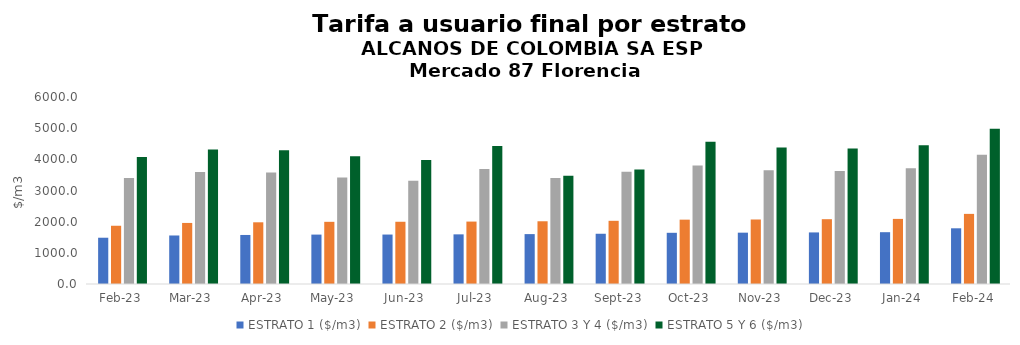
| Category | ESTRATO 1 ($/m3) | ESTRATO 2 ($/m3) | ESTRATO 3 Y 4 ($/m3) | ESTRATO 5 Y 6 ($/m3) |
|---|---|---|---|---|
| 2023-02-01 | 1484.64 | 1868.8 | 3398.26 | 4077.912 |
| 2023-03-01 | 1556.75 | 1959.18 | 3596.1 | 4315.32 |
| 2023-04-01 | 1573.28 | 1979.65 | 3575.22 | 4290.264 |
| 2023-05-01 | 1585.35 | 1995.07 | 3416.65 | 4099.98 |
| 2023-06-01 | 1586.86 | 1997.09 | 3316.57 | 3979.884 |
| 2023-07-01 | 1592.9 | 2003.01 | 3689.81 | 4427.772 |
| 2023-08-01 | 1600.9 | 2012.86 | 3401.48 | 3469.51 |
| 2023-09-01 | 1612.14 | 2027.25 | 3603.59 | 3675.662 |
| 2023-10-01 | 1642.77 | 2064.53 | 3805.44 | 4566.528 |
| 2023-11-01 | 1647.01 | 2069.85 | 3648.51 | 4378.212 |
| 2023-12-01 | 1654.75 | 2079.33 | 3624.28 | 4349.136 |
| 2024-01-01 | 1662.37 | 2089.02 | 3712.73 | 4455.276 |
| 2024-02-01 | 1787.28 | 2249.96 | 4149.96 | 4979.952 |